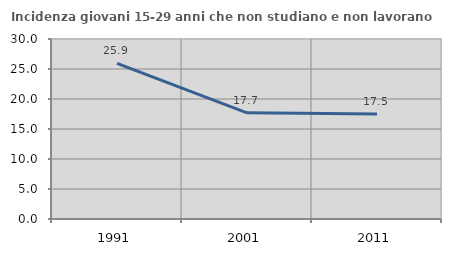
| Category | Incidenza giovani 15-29 anni che non studiano e non lavorano  |
|---|---|
| 1991.0 | 25.926 |
| 2001.0 | 17.695 |
| 2011.0 | 17.5 |